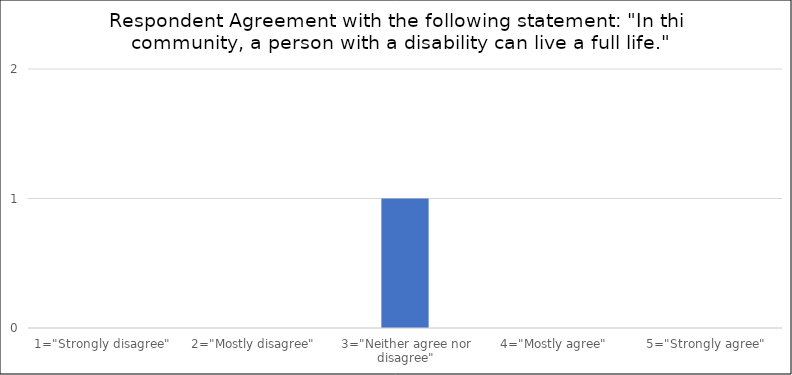
| Category | Number of Responses |
|---|---|
| 1="Strongly disagree" | 0 |
| 2="Mostly disagree" | 0 |
| 3="Neither agree nor disagree" | 1 |
| 4="Mostly agree" | 0 |
| 5="Strongly agree" | 0 |